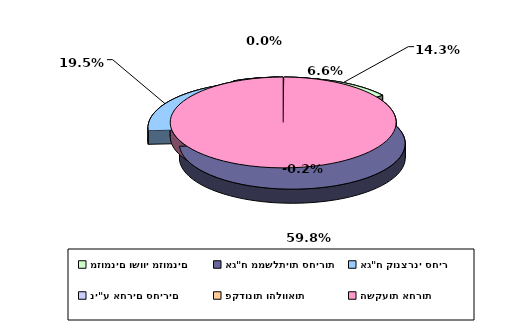
| Category | Series 0 |
|---|---|
| מזומנים ושווי מזומנים | 0.143 |
| אג"ח ממשלתיות סחירות | 0.598 |
| אג"ח קונצרני סחיר | 0.195 |
| ני"ע אחרים סחירים | 0.066 |
| פקדונות והלוואות | 0 |
| השקעות אחרות | -0.002 |